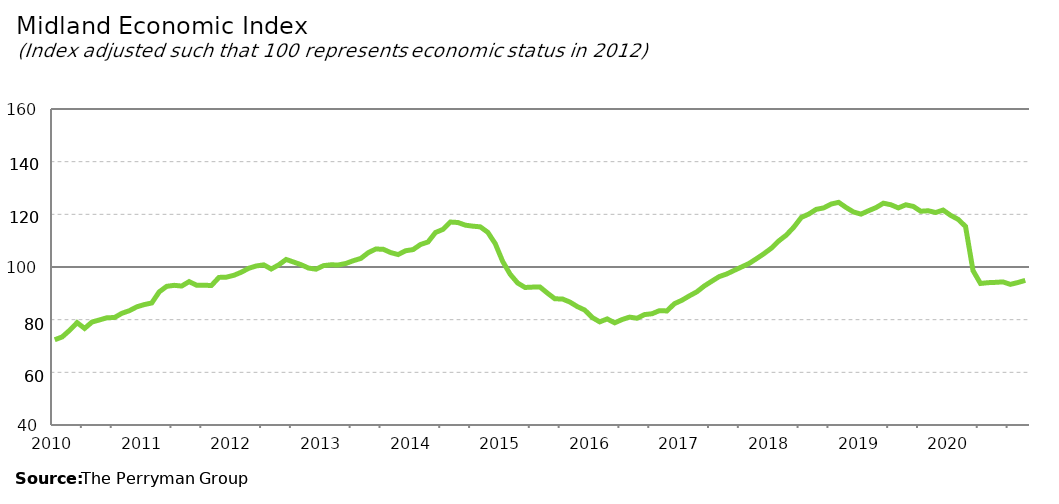
| Category | Midland Composite |
|---|---|
| 2010-01-31 | 72.369 |
| 2010-02-28 | 73.451 |
| 2010-03-31 | 75.978 |
| 2010-04-30 | 78.871 |
| 2010-05-31 | 76.677 |
| 2010-06-30 | 79.114 |
| 2010-07-31 | 79.904 |
| 2010-08-31 | 80.731 |
| 2010-09-30 | 80.807 |
| 2010-10-31 | 82.426 |
| 2010-11-30 | 83.407 |
| 2010-12-31 | 84.884 |
| 2011-01-31 | 85.731 |
| 2011-02-28 | 86.336 |
| 2011-03-31 | 90.573 |
| 2011-04-30 | 92.659 |
| 2011-05-31 | 93.04 |
| 2011-06-30 | 92.77 |
| 2011-07-31 | 94.444 |
| 2011-08-31 | 93.086 |
| 2011-09-30 | 93.032 |
| 2011-10-31 | 93.013 |
| 2011-11-30 | 96.045 |
| 2011-12-31 | 96.145 |
| 2012-01-31 | 96.852 |
| 2012-02-29 | 98.035 |
| 2012-03-31 | 99.525 |
| 2012-04-30 | 100.397 |
| 2012-05-31 | 100.809 |
| 2012-06-30 | 99.237 |
| 2012-07-31 | 100.81 |
| 2012-08-31 | 102.866 |
| 2012-09-30 | 101.877 |
| 2012-10-31 | 100.868 |
| 2012-11-30 | 99.596 |
| 2012-12-31 | 99.165 |
| 2013-01-31 | 100.515 |
| 2013-02-28 | 100.826 |
| 2013-03-31 | 100.781 |
| 2013-04-30 | 101.34 |
| 2013-05-31 | 102.399 |
| 2013-06-30 | 103.258 |
| 2013-07-31 | 105.446 |
| 2013-08-31 | 106.827 |
| 2013-09-30 | 106.734 |
| 2013-10-31 | 105.481 |
| 2013-11-30 | 104.723 |
| 2013-12-31 | 106.169 |
| 2014-01-31 | 106.612 |
| 2014-02-28 | 108.549 |
| 2014-03-31 | 109.502 |
| 2014-04-30 | 113.097 |
| 2014-05-31 | 114.284 |
| 2014-06-30 | 117.071 |
| 2014-07-31 | 116.901 |
| 2014-08-31 | 115.887 |
| 2014-09-30 | 115.507 |
| 2014-10-31 | 115.252 |
| 2014-11-30 | 113.19 |
| 2014-12-31 | 108.908 |
| 2015-01-31 | 102.125 |
| 2015-02-28 | 97.259 |
| 2015-03-31 | 93.936 |
| 2015-04-30 | 92.226 |
| 2015-05-31 | 92.363 |
| 2015-06-30 | 92.386 |
| 2015-07-31 | 90.077 |
| 2015-08-31 | 87.917 |
| 2015-09-30 | 87.864 |
| 2015-10-31 | 86.691 |
| 2015-11-30 | 84.968 |
| 2015-12-31 | 83.638 |
| 2016-01-31 | 80.823 |
| 2016-02-29 | 79.168 |
| 2016-03-31 | 80.279 |
| 2016-04-30 | 78.799 |
| 2016-05-31 | 80.049 |
| 2016-06-30 | 80.968 |
| 2016-07-31 | 80.54 |
| 2016-08-31 | 81.927 |
| 2016-09-30 | 82.246 |
| 2016-10-31 | 83.424 |
| 2016-11-30 | 83.315 |
| 2016-12-31 | 86.058 |
| 2017-01-31 | 87.361 |
| 2017-02-28 | 89.029 |
| 2017-03-31 | 90.562 |
| 2017-04-30 | 92.777 |
| 2017-05-31 | 94.586 |
| 2017-06-30 | 96.347 |
| 2017-07-31 | 97.341 |
| 2017-08-31 | 98.692 |
| 2017-09-30 | 100.01 |
| 2017-10-31 | 101.335 |
| 2017-11-30 | 103.16 |
| 2017-12-31 | 105.063 |
| 2018-01-31 | 107.177 |
| 2018-02-28 | 109.936 |
| 2018-03-31 | 112.13 |
| 2018-04-30 | 115.133 |
| 2018-05-31 | 118.819 |
| 2018-06-30 | 120.101 |
| 2018-07-31 | 121.894 |
| 2018-08-31 | 122.439 |
| 2018-09-30 | 123.907 |
| 2018-10-31 | 124.557 |
| 2018-11-30 | 122.603 |
| 2018-12-31 | 120.883 |
| 2019-01-31 | 120.081 |
| 2019-02-28 | 121.358 |
| 2019-03-31 | 122.544 |
| 2019-04-30 | 124.226 |
| 2019-05-31 | 123.639 |
| 2019-06-30 | 122.44 |
| 2019-07-31 | 123.623 |
| 2019-08-31 | 123.01 |
| 2019-09-30 | 121.173 |
| 2019-10-31 | 121.359 |
| 2019-11-30 | 120.69 |
| 2019-12-31 | 121.614 |
| 2020-01-31 | 119.616 |
| 2020-02-29 | 118.107 |
| 2020-03-31 | 115.395 |
| 2020-04-30 | 98.642 |
| 2020-05-31 | 93.742 |
| 2020-06-30 | 94.047 |
| 2020-07-31 | 94.166 |
| 2020-08-31 | 94.34 |
| 2020-09-30 | 93.408 |
| 2020-10-31 | 94.094 |
| 2020-11-30 | 94.922 |